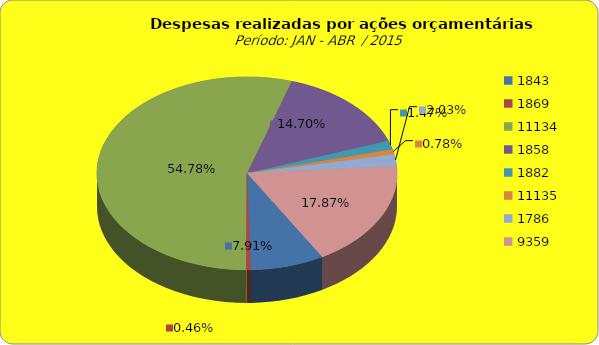
| Category | Series 1 |
|---|---|
| 1843.0 | 6442871.19 |
| 1869.0 | 373983.66 |
| 11134.0 | 44622716.76 |
| 1858.0 | 11972567.27 |
| 1882.0 | 1199230.64 |
| 11135.0 | 633965.42 |
| 1786.0 | 1656441.43 |
| 9359.0 | 14555769.48 |